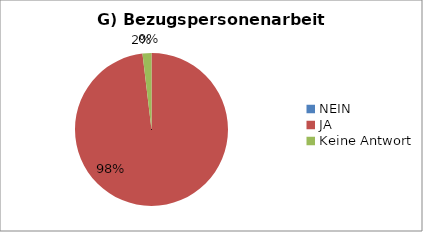
| Category | Series 0 |
|---|---|
| NEIN | 0 |
| JA | 52 |
| Keine Antwort | 1 |